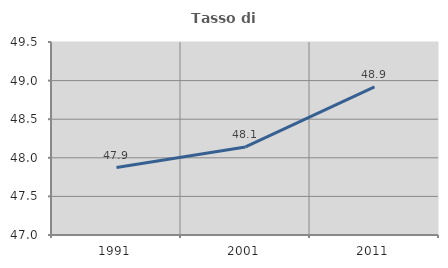
| Category | Tasso di occupazione   |
|---|---|
| 1991.0 | 47.873 |
| 2001.0 | 48.141 |
| 2011.0 | 48.92 |